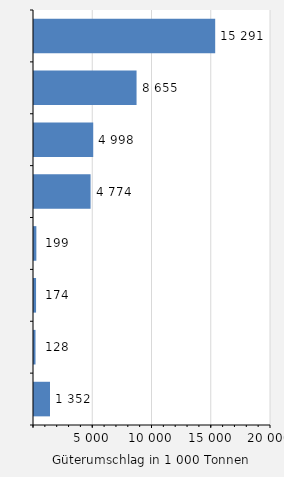
| Category | Güterumschlag |
|---|---|
| Lübeck | 15291 |
| Brunsbüttel | 8655 |
| Puttgarden / Fehmarn | 4998 |
| Kiel | 4774 |
| Dagebüll | 199 |
| Föhr | 174 |
| List / Sylt | 128 |
| Sonstige Häfen | 1352 |